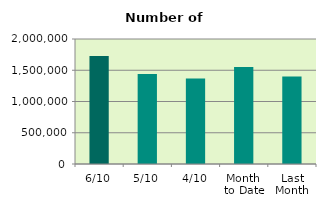
| Category | Series 0 |
|---|---|
| 6/10 | 1727234 |
| 5/10 | 1438950 |
| 4/10 | 1367902 |
| Month 
to Date | 1551257 |
| Last
Month | 1399299.909 |